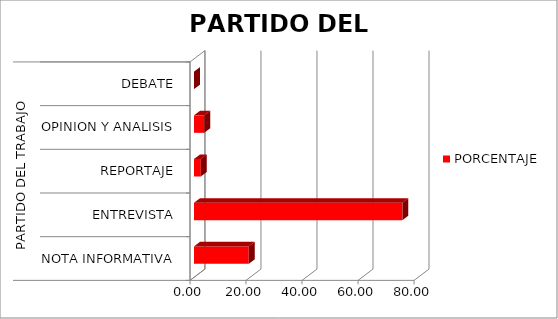
| Category | PORCENTAJE |
|---|---|
| 0 | 19.536 |
| 1 | 74.404 |
| 2 | 2.418 |
| 3 | 3.643 |
| 4 | 0 |